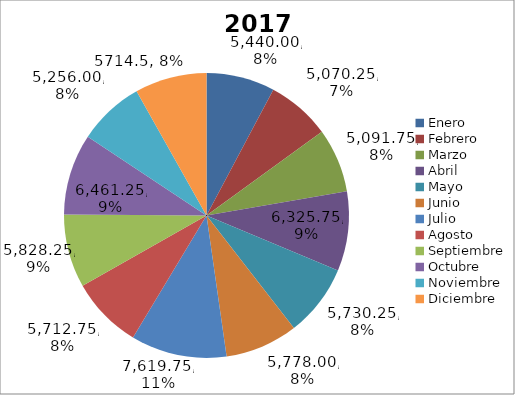
| Category | Año 2017 Valor $ | Año 2017 Toneladas |
|---|---|---|
| Enero | 5440 | 217.6 |
| Febrero | 5070.25 | 202.81 |
| Marzo | 5091.75 | 203.67 |
| Abril | 6325.75 | 253.03 |
| Mayo | 5730.25 | 229.21 |
| Junio | 5778 | 231.12 |
| Julio | 7619.75 | 304.79 |
| Agosto | 5712.75 | 228.51 |
| Septiembre | 5828.25 | 233.13 |
| Octubre | 6461.25 | 258.45 |
| Noviembre | 5256 | 210.24 |
| Diciembre | 5714.5 | 228.58 |